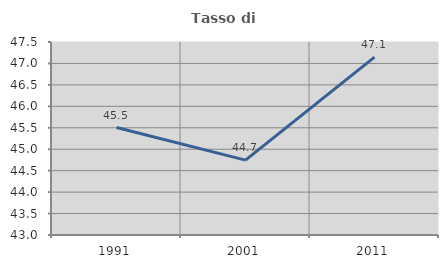
| Category | Tasso di occupazione   |
|---|---|
| 1991.0 | 45.506 |
| 2001.0 | 44.746 |
| 2011.0 | 47.146 |